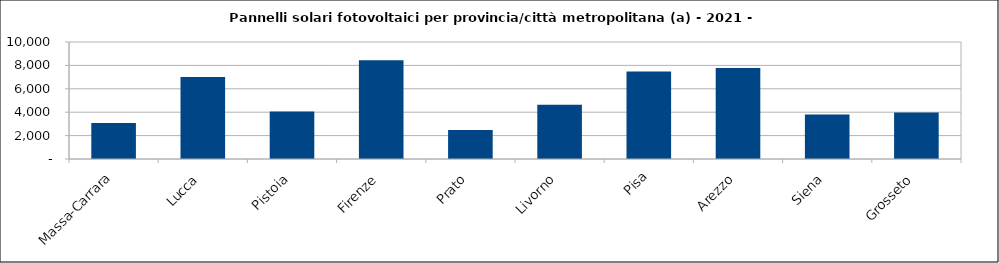
| Category | Series 0 |
|---|---|
| Massa-Carrara | 3070 |
| Lucca | 7004 |
| Pistoia | 4067 |
| Firenze | 8438 |
| Prato | 2473 |
| Livorno | 4643 |
| Pisa | 7469 |
| Arezzo | 7783 |
| Siena | 3812 |
| Grosseto | 3964 |